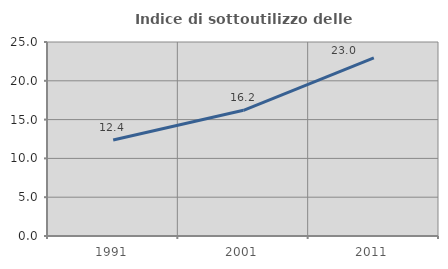
| Category | Indice di sottoutilizzo delle abitazioni  |
|---|---|
| 1991.0 | 12.374 |
| 2001.0 | 16.198 |
| 2011.0 | 22.964 |